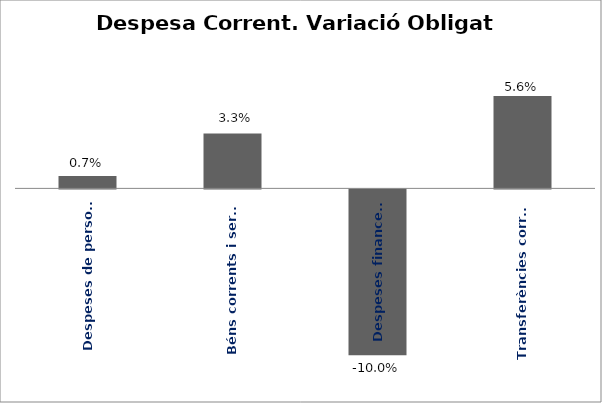
| Category | Series 0 |
|---|---|
| Despeses de personal | 0.007 |
| Béns corrents i serveis | 0.033 |
| Despeses financeres | -0.1 |
| Transferències corrents | 0.056 |